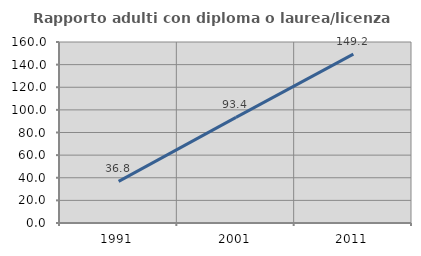
| Category | Rapporto adulti con diploma o laurea/licenza media  |
|---|---|
| 1991.0 | 36.757 |
| 2001.0 | 93.401 |
| 2011.0 | 149.239 |